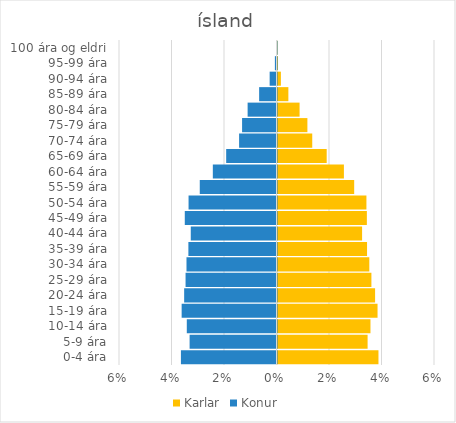
| Category | Karlar | Konur |
|---|---|---|
| 0-4 ára | 0.038 | -0.036 |
| 5-9 ára | 0.034 | -0.033 |
| 10-14 ára | 0.035 | -0.034 |
| 15-19 ára | 0.038 | -0.036 |
| 20-24 ára | 0.037 | -0.035 |
| 25-29 ára | 0.036 | -0.035 |
| 30-34 ára | 0.035 | -0.034 |
| 35-39 ára | 0.034 | -0.034 |
| 40-44 ára | 0.032 | -0.033 |
| 45-49 ára | 0.034 | -0.035 |
| 50-54 ára | 0.034 | -0.034 |
| 55-59 ára | 0.029 | -0.029 |
| 60-64 ára | 0.025 | -0.024 |
| 65-69 ára | 0.019 | -0.019 |
| 70-74 ára | 0.013 | -0.014 |
| 75-79 ára | 0.011 | -0.013 |
| 80-84 ára | 0.008 | -0.011 |
| 85-89 ára | 0.004 | -0.007 |
| 90-94 ára | 0.001 | -0.003 |
| 95-99 ára | 0 | -0.001 |
| 100 ára og eldri | 0 | 0 |